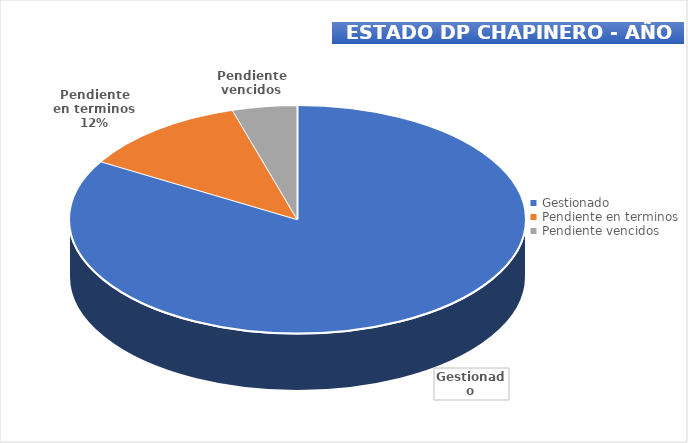
| Category | Total |
|---|---|
| Gestionado | 91 |
| Pendiente en terminos | 13 |
| Pendiente vencidos | 5 |